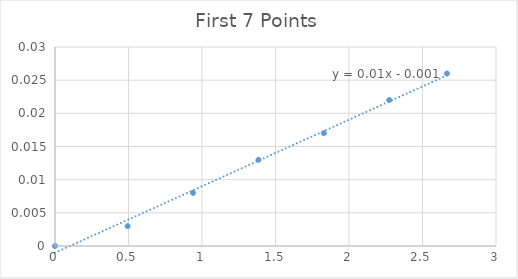
| Category | Series 0 |
|---|---|
| 0.0 | 0 |
| 0.49403159999999996 | 0.003 |
| 0.9390132 | 0.008 |
| 1.3839948 | 0.013 |
| 1.8289764 | 0.017 |
| 2.2739580000000004 | 0.022 |
| 2.666358 | 0.026 |